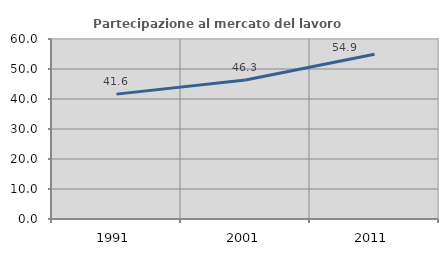
| Category | Partecipazione al mercato del lavoro  femminile |
|---|---|
| 1991.0 | 41.622 |
| 2001.0 | 46.318 |
| 2011.0 | 54.927 |